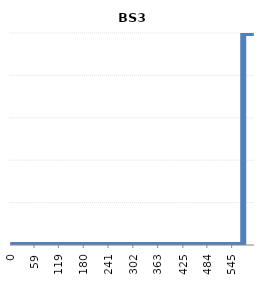
| Category | BS3 |
|---|---|
| 0.0 | 0 |
| 573.0 | 0 |
| 573.0 | 1 |
| 599.0 | 1 |
| 599.0 | 1 |